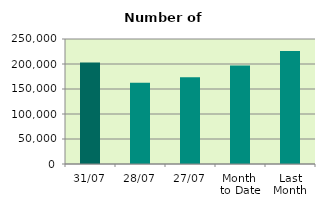
| Category | Series 0 |
|---|---|
| 31/07 | 203234 |
| 28/07 | 162508 |
| 27/07 | 173706 |
| Month 
to Date | 197154.286 |
| Last
Month | 226069.545 |